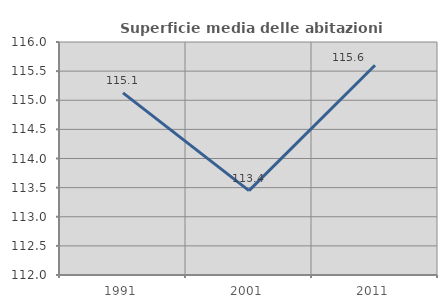
| Category | Superficie media delle abitazioni occupate |
|---|---|
| 1991.0 | 115.126 |
| 2001.0 | 113.449 |
| 2011.0 | 115.601 |